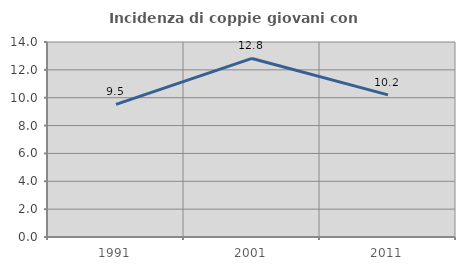
| Category | Incidenza di coppie giovani con figli |
|---|---|
| 1991.0 | 9.524 |
| 2001.0 | 12.821 |
| 2011.0 | 10.204 |